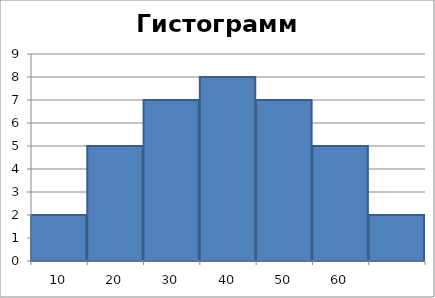
| Category | Частота |
|---|---|
| 10.0 | 2 |
| 20.0 | 5 |
| 30.0 | 7 |
| 40.0 | 8 |
| 50.0 | 7 |
| 60.0 | 5 |
| nan | 2 |